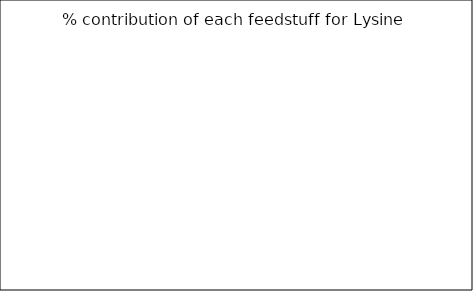
| Category | % of contribution off each feedstuff for Lysine |
|---|---|
| 0.0 | 0 |
| 0.0 | 0 |
| 0.0 | 0 |
| 0.0 | 0 |
| 0.0 | 0 |
| 0.0 | 0 |
| 0.0 | 0 |
| 0.0 | 0 |
| 0.0 | 0 |
| 0.0 | 0 |